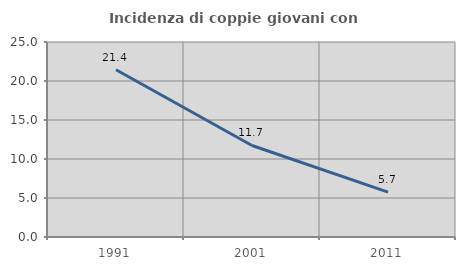
| Category | Incidenza di coppie giovani con figli |
|---|---|
| 1991.0 | 21.436 |
| 2001.0 | 11.736 |
| 2011.0 | 5.746 |